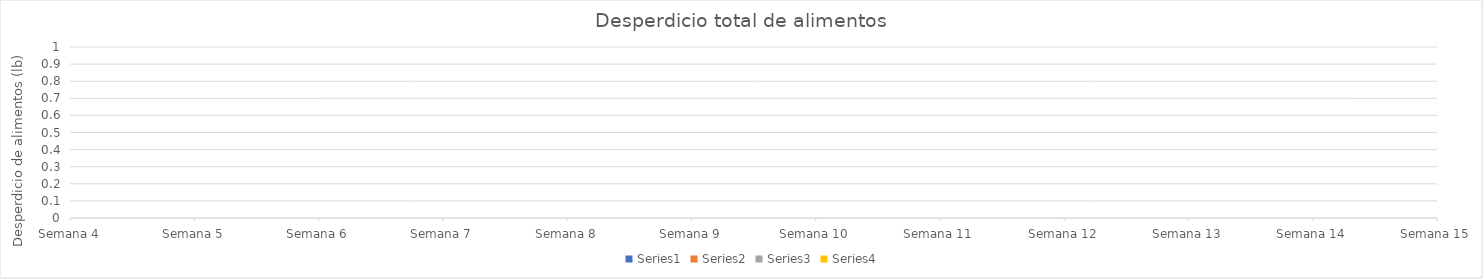
| Category | Series 0 | Series 1 | Series 2 | Series 3 |
|---|---|---|---|---|
| Semana 4 | 0 | 0 | 0 | 0 |
| Semana 5 | 0 | 0 | 0 | 0 |
| Semana 6 | 0 | 0 | 0 | 0 |
| Semana 7 | 0 | 0 | 0 | 0 |
| Semana 8 | 0 | 0 | 0 | 0 |
| Semana 9 | 0 | 0 | 0 | 0 |
| Semana 10 | 0 | 0 | 0 | 0 |
| Semana 11 | 0 | 0 | 0 | 0 |
| Semana 12 | 0 | 0 | 0 | 0 |
| Semana 13 | 0 | 0 | 0 | 0 |
| Semana 14 | 0 | 0 | 0 | 0 |
| Semana 15 | 0 | 0 | 0 | 0 |